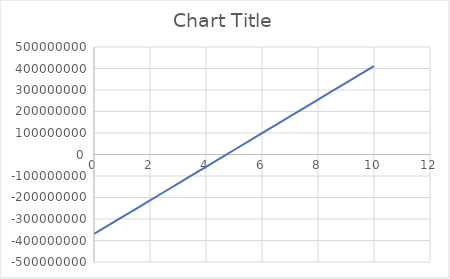
| Category | Series 0 |
|---|---|
| 0.0 | -369639903.082 |
| 1.0 | -291529503.363 |
| 2.0 | -213419103.645 |
| 3.0 | -135308703.927 |
| 4.0 | -57198304.208 |
| 5.0 | 20912095.51 |
| 6.0 | 99022495.228 |
| 7.0 | 177132894.946 |
| 8.0 | 255243294.665 |
| 9.0 | 333353694.383 |
| 10.0 | 411464094.101 |